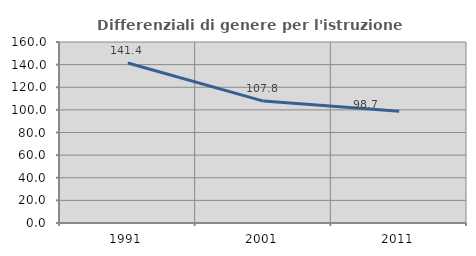
| Category | Differenziali di genere per l'istruzione superiore |
|---|---|
| 1991.0 | 141.384 |
| 2001.0 | 107.775 |
| 2011.0 | 98.72 |